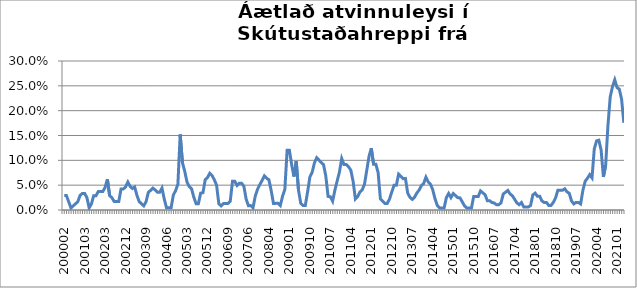
| Category | Series 0 |
|---|---|
| 200002 | 0.029 |
| 200003 | 0.029 |
| 200004 | 0.017 |
| 200005 | 0.004 |
| 200010 | 0.008 |
| 200011 | 0.012 |
| 200012 | 0.017 |
| 200101 | 0.029 |
| 200102 | 0.033 |
| 200103 | 0.033 |
| 200104 | 0.025 |
| 200105 | 0.004 |
| 200109 | 0.012 |
| 200110 | 0.029 |
| 200111 | 0.029 |
| 200112 | 0.037 |
| 200201 | 0.037 |
| 200202 | 0.037 |
| 200203 | 0.045 |
| 200204 | 0.062 |
| 200205 | 0.029 |
| 200206 | 0.025 |
| 200207 | 0.017 |
| 200208 | 0.017 |
| 200209 | 0.017 |
| 200210 | 0.042 |
| 200211 | 0.042 |
| 200212 | 0.046 |
| 200301 | 0.056 |
| 200302 | 0.048 |
| 200303 | 0.043 |
| 200304 | 0.046 |
| 200305 | 0.029 |
| 200306 | 0.017 |
| 200307 | 0.013 |
| 200308 | 0.008 |
| 200309 | 0.017 |
| 200310 | 0.035 |
| 200311 | 0.04 |
| 200312 | 0.044 |
| 200401 | 0.04 |
| 200402 | 0.036 |
| 200403 | 0.036 |
| 200404 | 0.044 |
| 200405 | 0.022 |
| 200406 | 0.004 |
| 200407 | 0.004 |
| 200408 | 0.004 |
| 200409 | 0.03 |
| 200410 | 0.039 |
| 200411 | 0.052 |
| 200412 | 0.152 |
| 200501 | 0.095 |
| 200502 | 0.078 |
| 200503 | 0.056 |
| 200504 | 0.047 |
| 200505 | 0.043 |
| 200506 | 0.026 |
| 200507 | 0.013 |
| 200508 | 0.013 |
| 200509 | 0.034 |
| 200510 | 0.035 |
| 200511 | 0.061 |
| 200512 | 0.065 |
| 200601 | 0.074 |
| 200602 | 0.07 |
| 200603 | 0.061 |
| 200604 | 0.05 |
| 200605 | 0.012 |
| 200606 | 0.008 |
| 200607 | 0.013 |
| 200608 | 0.013 |
| 200609 | 0.013 |
| 200610 | 0.018 |
| 200611 | 0.058 |
| 200612 | 0.058 |
| 200701 | 0.049 |
| 200702 | 0.054 |
| 200703 | 0.054 |
| 200704 | 0.048 |
| 200705 | 0.022 |
| 200706 | 0.009 |
| 200707 | 0.009 |
| 200708 | 0.004 |
| 200710 | 0.028 |
| 200711 | 0.042 |
| 200712 | 0.051 |
| 200801 | 0.059 |
| 200802 | 0.068 |
| 200803 | 0.064 |
| 200804 | 0.061 |
| 200805 | 0.039 |
| 200806 | 0.013 |
| 200807 | 0.013 |
| 200808 | 0.013 |
| 200809 | 0.009 |
| 200810 | 0.028 |
| 200811 | 0.042 |
| 200812 | 0.12 |
| 200901 | 0.12 |
| 200902 | 0.091 |
| 200903 | 0.067 |
| 200904 | 0.098 |
| 200905 | 0.04 |
| 200906 | 0.013 |
| 200907 | 0.009 |
| 200908 | 0.009 |
| 200909 | 0.036 |
| 200910 | 0.066 |
| 200911 | 0.076 |
| 200912 | 0.095 |
| 201001 | 0.105 |
| 201002 | 0.1 |
| 201003 | 0.096 |
| 201004 | 0.091 |
| 201005 | 0.068 |
| 201006 | 0.027 |
| 201007 | 0.027 |
| 201008 | 0.018 |
| 201009 | 0.04 |
| 201010 | 0.059 |
| 201011 | 0.077 |
| 201012 | 0.104 |
| 201101 | 0.092 |
| 201102 | 0.092 |
| 201103 | 0.087 |
| 201104 | 0.08 |
| 201105 | 0.058 |
| 201106 | 0.022 |
| 201107 | 0.027 |
| 201108 | 0.036 |
| 201109 | 0.041 |
| 201110 | 0.052 |
| 201111 | 0.08 |
| 201112 | 0.108 |
| 201201 | 0.124 |
| 201202 | 0.092 |
| 201203 | 0.092 |
| 201204 | 0.075 |
| 201205 | 0.022 |
| 201206 | 0.018 |
| 201207 | 0.013 |
| 201208 | 0.013 |
| 201209 | 0.022 |
| 201210 | 0.036 |
| 201211 | 0.05 |
| 201212 | 0.05 |
| 201301 | 0.072 |
| 201302 | 0.068 |
| 201303 | 0.063 |
| 201304 | 0.064 |
| 201305 | 0.034 |
| 201306 | 0.025 |
| 201307 | 0.021 |
| 201308 | 0.026 |
| 201309 | 0.034 |
| 201310 | 0.04 |
| 201311 | 0.049 |
| 201312 | 0.053 |
| 201401 | 0.066 |
| 201402 | 0.057 |
| 201403 | 0.052 |
| 201404 | 0.041 |
| 201405 | 0.023 |
| 201406 | 0.009 |
| 201407 | 0.004 |
| 201408 | 0.004 |
| 201409 | 0.004 |
| 201410 | 0.025 |
| 201411 | 0.033 |
| 201412 | 0.025 |
| 201501 | 0.033 |
| 201502 | 0.029 |
| 201503 | 0.025 |
| 201504 | 0.024 |
| 201505 | 0.016 |
| 201506 | 0.008 |
| 201507 | 0.004 |
| 201508 | 0.004 |
| 201509 | 0.004 |
| 201510 | 0.027 |
| 201511 | 0.027 |
| 201512 | 0.027 |
| 201601 | 0.038 |
| 201602 | 0.035 |
| 201603 | 0.031 |
| 201604 | 0.019 |
| 201605 | 0.019 |
| 201606 | 0.015 |
| 201607 | 0.014 |
| 201608 | 0.011 |
| 201609 | 0.011 |
| 201610 | 0.014 |
| 201611 | 0.032 |
| 201612 | 0.036 |
| 201701 | 0.039 |
| 201702 | 0.032 |
| 201703 | 0.029 |
| 201704 | 0.021 |
| 201705 | 0.014 |
| 201706 | 0.011 |
| 201707 | 0.015 |
| 201708 | 0.006 |
| 201709 | 0.006 |
| 201710 | 0.006 |
| 201711 | 0.009 |
| 201712 | 0.03 |
| 201801 | 0.034 |
| 201802 | 0.028 |
| 201803 | 0.028 |
| 201804 | 0.018 |
| 201805 | 0.015 |
| 201806 | 0.015 |
| 201807 | 0.009 |
| 201808 | 0.009 |
| 201809 | 0.015 |
| 201810 | 0.025 |
| 201811 | 0.04 |
| 201812 | 0.04 |
| 201901 | 0.04 |
| 201902 | 0.043 |
| 201903 | 0.037 |
| 201904 | 0.034 |
| 201905 | 0.018 |
| 201906 | 0.012 |
| 201907 | 0.015 |
| 201908 | 0.015 |
| 201909 | 0.012 |
| 201910 | 0.04 |
| 201911 | 0.058 |
| 201912 | 0.064 |
| 202001 | 0.071 |
| 202002 | 0.065 |
| 202003 | 0.123 |
| 202004 | 0.139 |
| 202005 | 0.141 |
| 202006 | 0.121 |
| 202007 | 0.067 |
| 202008 | 0.09 |
| 202009 | 0.17 |
| 202010 | 0.228 |
| 202011 | 0.248 |
| 202012 | 0.262 |
| 202101 | 0.247 |
| 202102 | 0.243 |
| 202103 | 0.223 |
| 202104 | 0.176 |